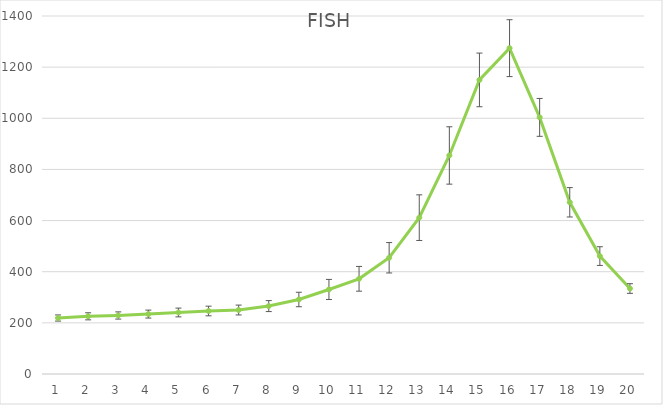
| Category | FISH |
|---|---|
| 0 | 218.966 |
| 1 | 225.593 |
| 2 | 228.849 |
| 3 | 234.383 |
| 4 | 240.585 |
| 5 | 246.368 |
| 6 | 250.222 |
| 7 | 265.619 |
| 8 | 291.36 |
| 9 | 330.585 |
| 10 | 372.268 |
| 11 | 454.554 |
| 12 | 611.359 |
| 13 | 854.623 |
| 14 | 1150.069 |
| 15 | 1274.223 |
| 16 | 1003.508 |
| 17 | 671.492 |
| 18 | 461.091 |
| 19 | 334.285 |